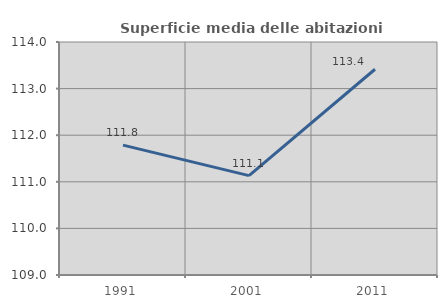
| Category | Superficie media delle abitazioni occupate |
|---|---|
| 1991.0 | 111.787 |
| 2001.0 | 111.133 |
| 2011.0 | 113.415 |